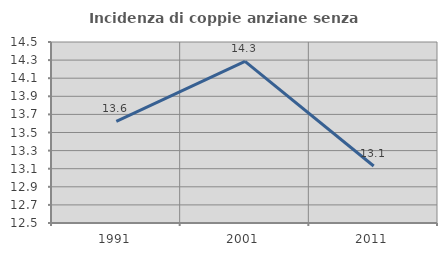
| Category | Incidenza di coppie anziane senza figli  |
|---|---|
| 1991.0 | 13.622 |
| 2001.0 | 14.286 |
| 2011.0 | 13.129 |